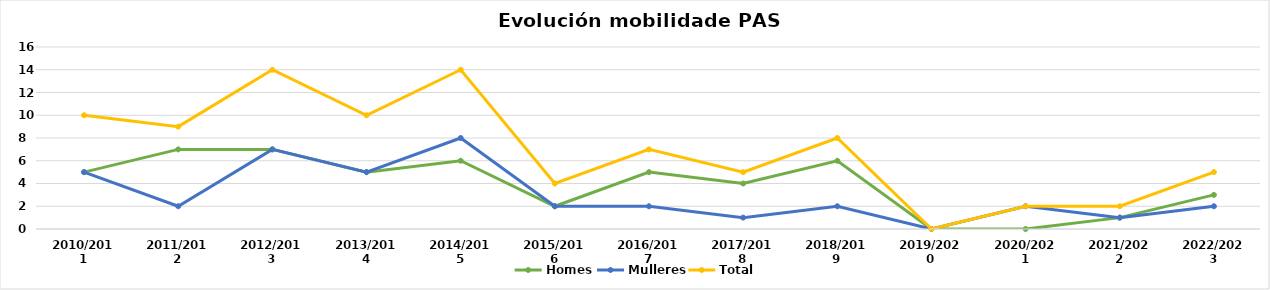
| Category | Homes | Mulleres | Total |
|---|---|---|---|
| 2010/2011 | 5 | 5 | 10 |
| 2011/2012 | 7 | 2 | 9 |
| 2012/2013 | 7 | 7 | 14 |
| 2013/2014 | 5 | 5 | 10 |
| 2014/2015 | 6 | 8 | 14 |
| 2015/2016 | 2 | 2 | 4 |
| 2016/2017 | 5 | 2 | 7 |
| 2017/2018 | 4 | 1 | 5 |
| 2018/2019 | 6 | 2 | 8 |
| 2019/2020 | 0 | 0 | 0 |
| 2020/2021 | 0 | 2 | 2 |
| 2021/2022 | 1 | 1 | 2 |
| 2022/2023 | 3 | 2 | 5 |